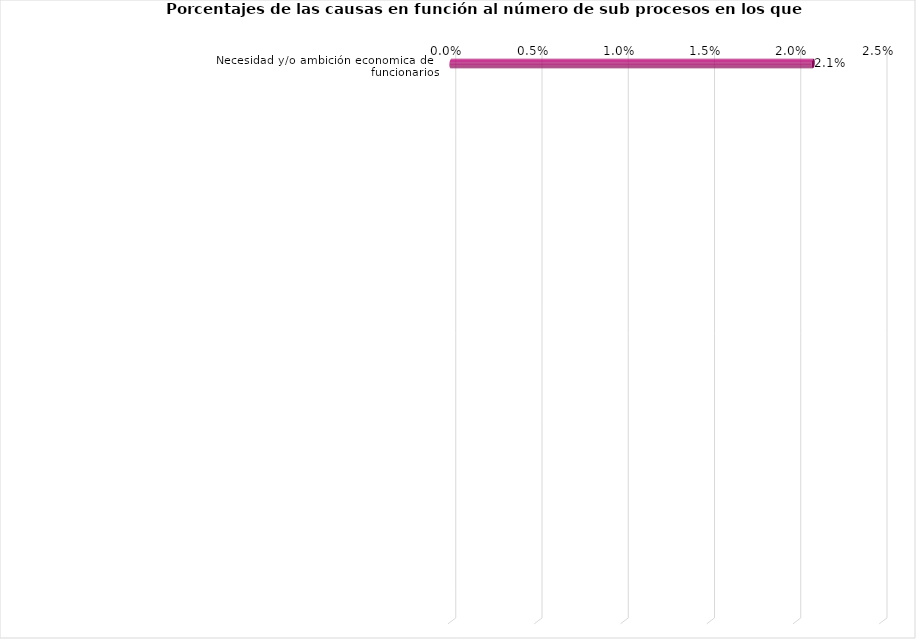
| Category | Series 0 |
|---|---|
| Necesidad y/o ambición economica de los funcionarios. | 0.021 |